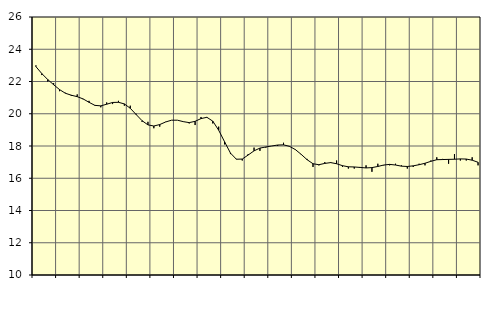
| Category | Piggar | Tillverkning o utvinning, energi o miljö, SNI 05-33, 35-39 |
|---|---|---|
| nan | 23 | 22.92 |
| 1.0 | 22.4 | 22.49 |
| 1.0 | 22 | 22.12 |
| 1.0 | 21.9 | 21.8 |
| nan | 21.4 | 21.5 |
| 2.0 | 21.3 | 21.27 |
| 2.0 | 21.1 | 21.15 |
| 2.0 | 21.2 | 21.06 |
| nan | 20.9 | 20.92 |
| 3.0 | 20.8 | 20.71 |
| 3.0 | 20.5 | 20.52 |
| 3.0 | 20.4 | 20.49 |
| nan | 20.7 | 20.59 |
| 4.0 | 20.6 | 20.7 |
| 4.0 | 20.8 | 20.71 |
| 4.0 | 20.5 | 20.61 |
| nan | 20.5 | 20.34 |
| 5.0 | 20 | 19.95 |
| 5.0 | 19.5 | 19.57 |
| 5.0 | 19.5 | 19.31 |
| nan | 19.1 | 19.24 |
| 6.0 | 19.2 | 19.33 |
| 6.0 | 19.5 | 19.49 |
| 6.0 | 19.6 | 19.6 |
| nan | 19.6 | 19.6 |
| 7.0 | 19.5 | 19.51 |
| 7.0 | 19.4 | 19.45 |
| 7.0 | 19.3 | 19.53 |
| nan | 19.8 | 19.7 |
| 8.0 | 19.8 | 19.78 |
| 8.0 | 19.4 | 19.54 |
| 8.0 | 19.2 | 18.98 |
| nan | 18.1 | 18.26 |
| 9.0 | 17.5 | 17.56 |
| 9.0 | 17.2 | 17.18 |
| 9.0 | 17.1 | 17.19 |
| nan | 17.5 | 17.44 |
| 10.0 | 17.9 | 17.7 |
| 10.0 | 17.7 | 17.87 |
| 10.0 | 17.9 | 17.94 |
| nan | 18 | 18 |
| 11.0 | 18 | 18.06 |
| 11.0 | 18.2 | 18.07 |
| 11.0 | 18 | 17.98 |
| nan | 17.8 | 17.78 |
| 12.0 | 17.5 | 17.48 |
| 12.0 | 17.2 | 17.15 |
| 12.0 | 16.7 | 16.9 |
| nan | 16.8 | 16.84 |
| 13.0 | 17 | 16.92 |
| 13.0 | 17 | 16.97 |
| 13.0 | 17.1 | 16.9 |
| nan | 16.7 | 16.78 |
| 14.0 | 16.6 | 16.71 |
| 14.0 | 16.6 | 16.7 |
| 14.0 | 16.7 | 16.67 |
| nan | 16.8 | 16.64 |
| 15.0 | 16.4 | 16.66 |
| 15.0 | 16.9 | 16.73 |
| 15.0 | 16.8 | 16.82 |
| nan | 16.8 | 16.86 |
| 16.0 | 16.9 | 16.82 |
| 16.0 | 16.8 | 16.75 |
| 16.0 | 16.6 | 16.73 |
| nan | 16.7 | 16.77 |
| 17.0 | 16.9 | 16.84 |
| 17.0 | 16.8 | 16.93 |
| 17.0 | 17.1 | 17.05 |
| nan | 17.3 | 17.15 |
| 18.0 | 17.2 | 17.16 |
| 18.0 | 16.9 | 17.17 |
| 18.0 | 17.5 | 17.18 |
| nan | 17.1 | 17.2 |
| 19.0 | 17.1 | 17.19 |
| 19.0 | 17.3 | 17.12 |
| 19.0 | 16.8 | 16.99 |